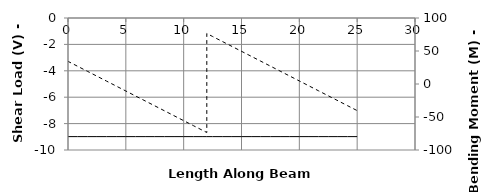
| Category | V |
|---|---|
| 0.0 | -8.986 |
| 0.0 | -8.986 |
| 0.0 | -8.986 |
| 0.8333333333333334 | -8.986 |
| 1.6666666666666667 | -8.986 |
| 2.5 | -8.986 |
| 3.3333333333333335 | -8.986 |
| 4.166666666666667 | -8.986 |
| 5.0 | -8.986 |
| 5.833333333333334 | -8.986 |
| 6.666666666666667 | -8.986 |
| 7.5 | -8.986 |
| 8.333333333333334 | -8.986 |
| 9.166666666666668 | -8.986 |
| 10.0 | -8.986 |
| 10.833333333333334 | -8.986 |
| 11.666666666666668 | -8.986 |
| 11.9999 | -8.986 |
| 12.0001 | -8.986 |
| 12.5 | -8.986 |
| 13.333333333333334 | -8.986 |
| 14.166666666666668 | -8.986 |
| 15.0 | -8.986 |
| 15.833333333333334 | -8.986 |
| 16.666666666666668 | -8.986 |
| 17.5 | -8.986 |
| 18.333333333333336 | -8.986 |
| 19.166666666666668 | -8.986 |
| 20.0 | -8.986 |
| 20.833333333333336 | -8.986 |
| 21.666666666666668 | -8.986 |
| 22.5 | -8.986 |
| 23.333333333333336 | -8.986 |
| 24.166666666666668 | -8.986 |
| 25.0 | -8.986 |